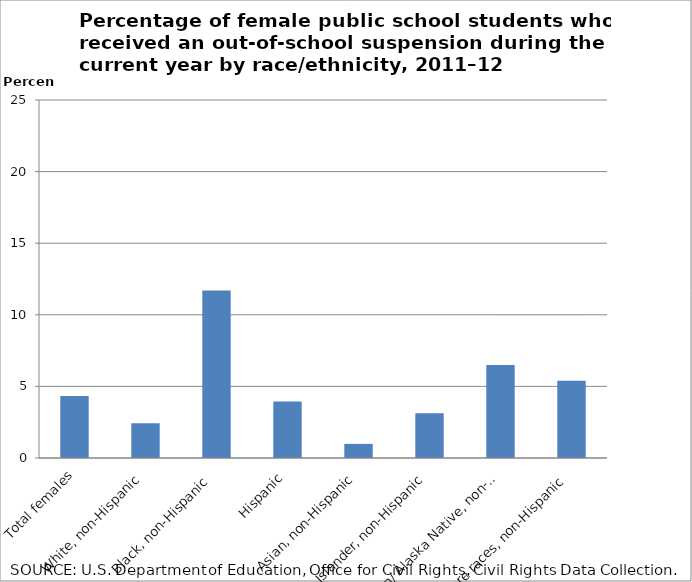
| Category | Series 1 |
|---|---|
| Total females | 4.335 |
| White, non-Hispanic | 2.433 |
| Black, non-Hispanic  | 11.703 |
| Hispanic | 3.952 |
| Asian, non-Hispanic | 0.984 |
| Pacific Islander, non-Hispanic | 3.122 |
| American Indian/ Alaska Native, non-Hispanic | 6.501 |
| Two or more races, non-Hispanic | 5.398 |